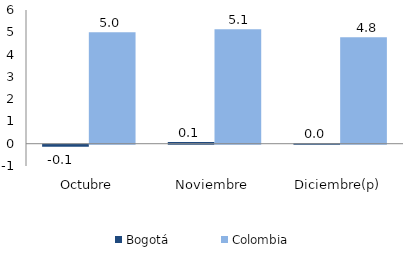
| Category | Bogotá | Colombia |
|---|---|---|
| Octubre | -0.089 | 5.006 |
| Noviembre | 0.081 | 5.138 |
| Diciembre(p) | 0.025 | 4.78 |